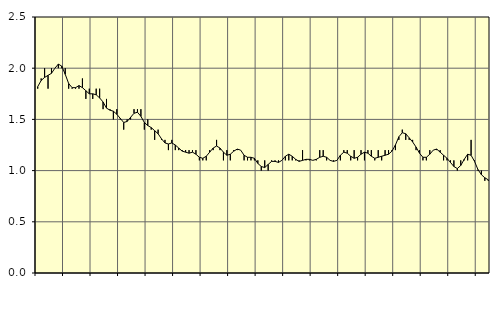
| Category | Piggar | Jordbruk, skogsbruk o fiske, SNI 01-03 |
|---|---|---|
| nan | 1.8 | 1.82 |
| 87.0 | 1.9 | 1.88 |
| 87.0 | 2 | 1.91 |
| 87.0 | 1.8 | 1.93 |
| nan | 2 | 1.95 |
| 88.0 | 2 | 2 |
| 88.0 | 2 | 2.04 |
| 88.0 | 2 | 2.02 |
| nan | 2 | 1.94 |
| 89.0 | 1.8 | 1.85 |
| 89.0 | 1.8 | 1.81 |
| 89.0 | 1.8 | 1.81 |
| nan | 1.8 | 1.83 |
| 90.0 | 1.9 | 1.81 |
| 90.0 | 1.7 | 1.78 |
| 90.0 | 1.8 | 1.75 |
| nan | 1.7 | 1.75 |
| 91.0 | 1.8 | 1.74 |
| 91.0 | 1.8 | 1.71 |
| 91.0 | 1.6 | 1.67 |
| nan | 1.7 | 1.61 |
| 92.0 | 1.6 | 1.59 |
| 92.0 | 1.5 | 1.58 |
| 92.0 | 1.6 | 1.55 |
| nan | 1.5 | 1.51 |
| 93.0 | 1.4 | 1.47 |
| 93.0 | 1.5 | 1.48 |
| 93.0 | 1.5 | 1.52 |
| nan | 1.6 | 1.56 |
| 94.0 | 1.6 | 1.57 |
| 94.0 | 1.6 | 1.53 |
| 94.0 | 1.4 | 1.47 |
| nan | 1.5 | 1.44 |
| 95.0 | 1.4 | 1.42 |
| 95.0 | 1.3 | 1.39 |
| 95.0 | 1.4 | 1.36 |
| nan | 1.3 | 1.31 |
| 96.0 | 1.3 | 1.27 |
| 96.0 | 1.2 | 1.26 |
| 96.0 | 1.3 | 1.27 |
| nan | 1.2 | 1.25 |
| 97.0 | 1.2 | 1.22 |
| 97.0 | 1.2 | 1.19 |
| 97.0 | 1.2 | 1.18 |
| nan | 1.2 | 1.17 |
| 98.0 | 1.2 | 1.18 |
| 98.0 | 1.2 | 1.16 |
| 98.0 | 1.1 | 1.13 |
| nan | 1.1 | 1.12 |
| 99.0 | 1.1 | 1.14 |
| 99.0 | 1.2 | 1.18 |
| 99.0 | 1.2 | 1.22 |
| nan | 1.3 | 1.24 |
| 0.0 | 1.2 | 1.22 |
| 0.0 | 1.1 | 1.18 |
| 0.0 | 1.2 | 1.15 |
| nan | 1.1 | 1.16 |
| 1.0 | 1.2 | 1.19 |
| 1.0 | 1.2 | 1.21 |
| 1.0 | 1.2 | 1.2 |
| nan | 1.1 | 1.15 |
| 2.0 | 1.1 | 1.13 |
| 2.0 | 1.1 | 1.13 |
| 2.0 | 1.1 | 1.12 |
| nan | 1.1 | 1.07 |
| 3.0 | 1 | 1.04 |
| 3.0 | 1.1 | 1.03 |
| 3.0 | 1 | 1.06 |
| nan | 1.1 | 1.09 |
| 4.0 | 1.1 | 1.09 |
| 4.0 | 1.1 | 1.08 |
| 4.0 | 1.1 | 1.1 |
| nan | 1.1 | 1.14 |
| 5.0 | 1.1 | 1.16 |
| 5.0 | 1.1 | 1.14 |
| 5.0 | 1.1 | 1.11 |
| nan | 1.1 | 1.09 |
| 6.0 | 1.2 | 1.1 |
| 6.0 | 1.1 | 1.11 |
| 6.0 | 1.1 | 1.11 |
| nan | 1.1 | 1.1 |
| 7.0 | 1.1 | 1.11 |
| 7.0 | 1.2 | 1.13 |
| 7.0 | 1.2 | 1.14 |
| nan | 1.1 | 1.13 |
| 8.0 | 1.1 | 1.1 |
| 8.0 | 1.1 | 1.09 |
| 8.0 | 1.1 | 1.1 |
| nan | 1.1 | 1.15 |
| 9.0 | 1.2 | 1.18 |
| 9.0 | 1.2 | 1.17 |
| 9.0 | 1.1 | 1.14 |
| nan | 1.2 | 1.12 |
| 10.0 | 1.1 | 1.13 |
| 10.0 | 1.2 | 1.16 |
| 10.0 | 1.1 | 1.18 |
| nan | 1.2 | 1.17 |
| 11.0 | 1.2 | 1.14 |
| 11.0 | 1.1 | 1.12 |
| 11.0 | 1.2 | 1.13 |
| nan | 1.1 | 1.14 |
| 12.0 | 1.2 | 1.15 |
| 12.0 | 1.2 | 1.16 |
| 12.0 | 1.2 | 1.19 |
| nan | 1.2 | 1.25 |
| 13.0 | 1.3 | 1.33 |
| 13.0 | 1.4 | 1.37 |
| 13.0 | 1.3 | 1.36 |
| nan | 1.3 | 1.32 |
| 14.0 | 1.3 | 1.28 |
| 14.0 | 1.2 | 1.23 |
| 14.0 | 1.2 | 1.17 |
| nan | 1.1 | 1.13 |
| 15.0 | 1.1 | 1.13 |
| 15.0 | 1.2 | 1.16 |
| 15.0 | 1.2 | 1.2 |
| nan | 1.2 | 1.21 |
| 16.0 | 1.2 | 1.18 |
| 16.0 | 1.1 | 1.15 |
| 16.0 | 1.1 | 1.12 |
| nan | 1.1 | 1.08 |
| 17.0 | 1.1 | 1.04 |
| 17.0 | 1 | 1.02 |
| 17.0 | 1.1 | 1.05 |
| nan | 1.1 | 1.11 |
| 18.0 | 1.1 | 1.16 |
| 18.0 | 1.3 | 1.15 |
| 18.0 | 1.1 | 1.09 |
| nan | 1 | 1.01 |
| 19.0 | 1 | 0.96 |
| 19.0 | 0.9 | 0.93 |
| 19.0 | 0.9 | 0.91 |